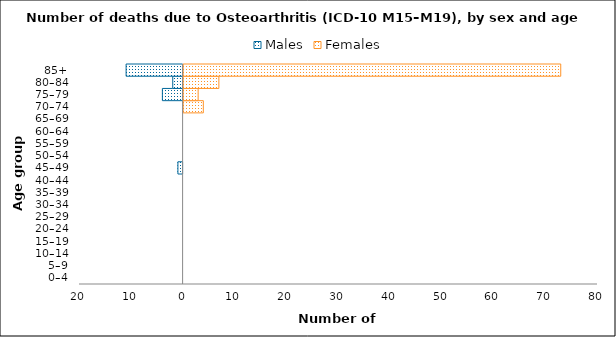
| Category | Males | Females |
|---|---|---|
| 0–4 | 0 | 0 |
| 5–9 | 0 | 0 |
| 10–14 | 0 | 0 |
| 15–19 | 0 | 0 |
| 20–24 | 0 | 0 |
| 25–29 | 0 | 0 |
| 30–34 | 0 | 0 |
| 35–39 | 0 | 0 |
| 40–44 | 0 | 0 |
| 45–49 | -1 | 0 |
| 50–54 | 0 | 0 |
| 55–59 | 0 | 0 |
| 60–64 | 0 | 0 |
| 65–69 | 0 | 0 |
| 70–74 | 0 | 4 |
| 75–79 | -4 | 3 |
| 80–84 | -2 | 7 |
| 85+ | -11 | 73 |